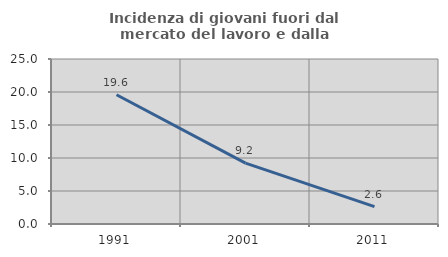
| Category | Incidenza di giovani fuori dal mercato del lavoro e dalla formazione  |
|---|---|
| 1991.0 | 19.588 |
| 2001.0 | 9.231 |
| 2011.0 | 2.632 |